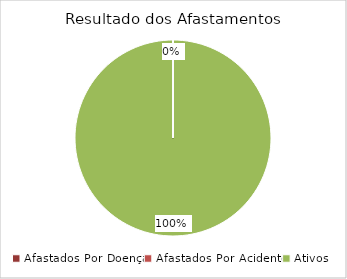
| Category | Total |
|---|---|
| Afastados Por Doença | 0 |
| Afastados Por Acidente | 0 |
| Ativos | 1 |